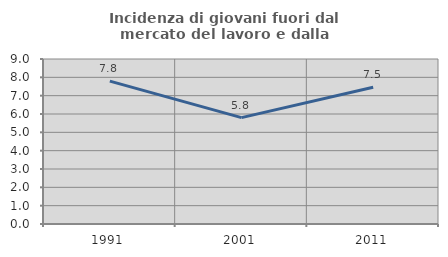
| Category | Incidenza di giovani fuori dal mercato del lavoro e dalla formazione  |
|---|---|
| 1991.0 | 7.791 |
| 2001.0 | 5.804 |
| 2011.0 | 7.463 |